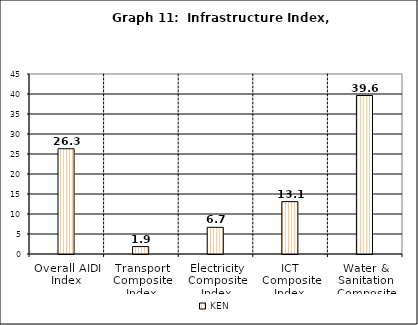
| Category | Series 0 | KEN | Series 2 |
|---|---|---|---|
| Overall AIDI Index |  | 26.318 |  |
| Transport Composite Index |  | 1.859 |  |
| Electricity Composite Index |  | 6.667 |  |
| ICT Composite Index  |  | 13.092 |  |
| Water & Sanitation Composite Index |  | 39.617 |  |